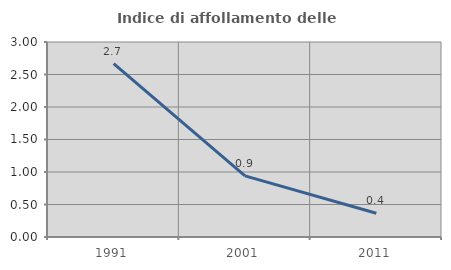
| Category | Indice di affollamento delle abitazioni  |
|---|---|
| 1991.0 | 2.668 |
| 2001.0 | 0.94 |
| 2011.0 | 0.365 |